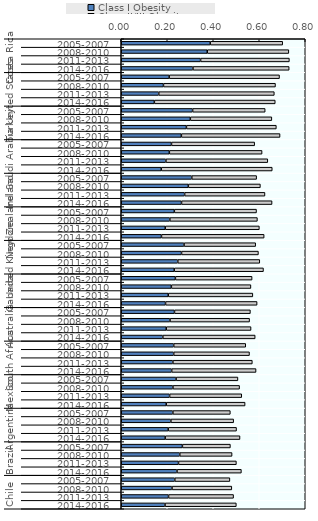
| Category | Class I Obesity | Class II/III Obesity |
|---|---|---|
| 0 | 0.387 | 0.315 |
| 1 | 0.374 | 0.355 |
| 2 | 0.345 | 0.386 |
| 3 | 0.312 | 0.418 |
| 4 | 0.208 | 0.48 |
| 5 | 0.183 | 0.487 |
| 6 | 0.163 | 0.503 |
| 7 | 0.144 | 0.526 |
| 8 | 0.31 | 0.316 |
| 9 | 0.3 | 0.354 |
| 10 | 0.283 | 0.391 |
| 11 | 0.261 | 0.429 |
| 12 | 0.218 | 0.362 |
| 13 | 0.209 | 0.403 |
| 14 | 0.194 | 0.443 |
| 15 | 0.174 | 0.483 |
| 16 | 0.307 | 0.282 |
| 17 | 0.292 | 0.313 |
| 18 | 0.276 | 0.349 |
| 19 | 0.262 | 0.394 |
| 20 | 0.231 | 0.357 |
| 21 | 0.211 | 0.381 |
| 22 | 0.191 | 0.409 |
| 23 | 0.175 | 0.446 |
| 24 | 0.273 | 0.312 |
| 25 | 0.262 | 0.334 |
| 26 | 0.246 | 0.357 |
| 27 | 0.23 | 0.388 |
| 28 | 0.235 | 0.334 |
| 29 | 0.218 | 0.346 |
| 30 | 0.204 | 0.368 |
| 31 | 0.193 | 0.398 |
| 32 | 0.231 | 0.33 |
| 33 | 0.212 | 0.346 |
| 34 | 0.196 | 0.369 |
| 35 | 0.181 | 0.402 |
| 36 | 0.228 | 0.313 |
| 37 | 0.228 | 0.33 |
| 38 | 0.224 | 0.345 |
| 39 | 0.219 | 0.367 |
| 40 | 0.238 | 0.269 |
| 41 | 0.225 | 0.29 |
| 42 | 0.21 | 0.314 |
| 43 | 0.196 | 0.343 |
| 44 | 0.224 | 0.25 |
| 45 | 0.216 | 0.273 |
| 46 | 0.204 | 0.297 |
| 47 | 0.191 | 0.325 |
| 48 | 0.266 | 0.209 |
| 49 | 0.254 | 0.227 |
| 50 | 0.249 | 0.252 |
| 51 | 0.242 | 0.28 |
| 52 | 0.233 | 0.24 |
| 53 | 0.221 | 0.26 |
| 54 | 0.206 | 0.283 |
| 55 | 0.19 | 0.31 |